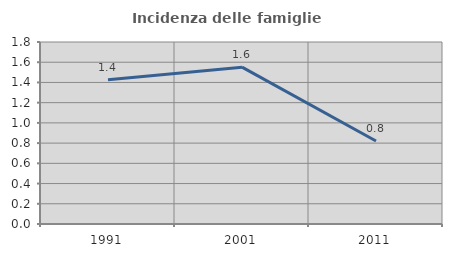
| Category | Incidenza delle famiglie numerose |
|---|---|
| 1991.0 | 1.426 |
| 2001.0 | 1.551 |
| 2011.0 | 0.821 |